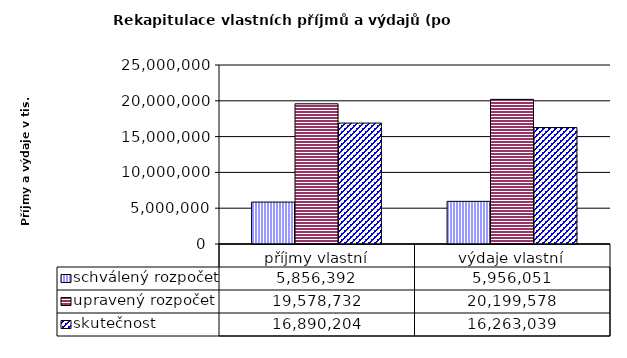
| Category | schválený rozpočet | upravený rozpočet | skutečnost |
|---|---|---|---|
| příjmy vlastní | 5856392 | 19578732 | 16890204 |
| výdaje vlastní | 5956051 | 20199578 | 16263039 |